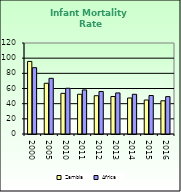
| Category | Zambia | Africa |
|---|---|---|
| 2000.0 | 95.7 | 87.462 |
| 2005.0 | 66.9 | 73.418 |
| 2010.0 | 53.6 | 60.345 |
| 2011.0 | 52.4 | 58.107 |
| 2012.0 | 50.5 | 56.032 |
| 2013.0 | 49.4 | 54.131 |
| 2014.0 | 47.5 | 52.336 |
| 2015.0 | 44.8 | 50.754 |
| 2016.0 | 43.8 | 49.283 |